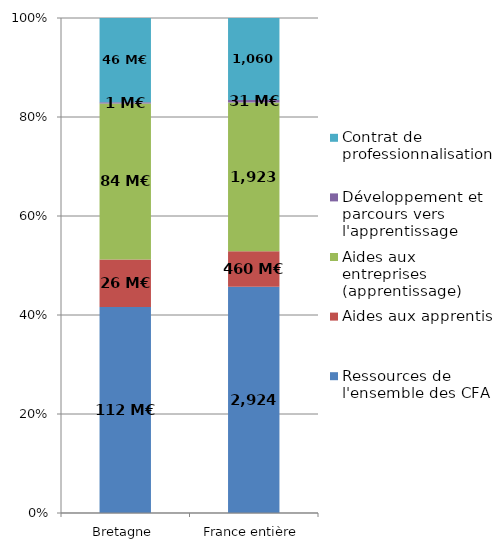
| Category | Ressources de l'ensemble des CFA | Aides aux apprentis | Aides aux entreprises (apprentissage) | Développement et parcours vers l'apprentissage | Contrat de professionnalisation |
|---|---|---|---|---|---|
| Bretagne | 111.543 | 25.828 | 84.443 | 0.62 | 45.685 |
| France entière | 2924.219 | 459.796 | 1923.184 | 31.421 | 1060.48 |